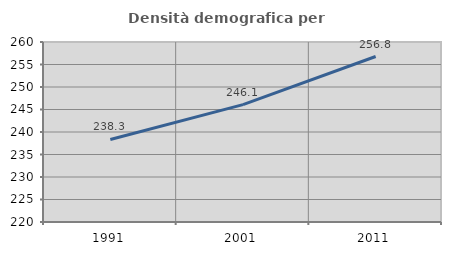
| Category | Densità demografica |
|---|---|
| 1991.0 | 238.341 |
| 2001.0 | 246.077 |
| 2011.0 | 256.777 |